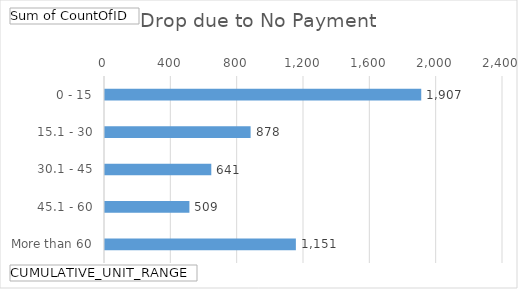
| Category | Total |
|---|---|
| 0 - 15 | 1907 |
| 15.1 - 30 | 878 |
| 30.1 - 45 | 641 |
| 45.1 - 60 | 509 |
| More than 60 | 1151 |